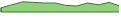
| Category | Series 0 |
|---|---|
| 0 | 7 |
| 1 | 12 |
| 2 | 17 |
| 3 | 16 |
| 4 | 15 |
| 5 | 15 |
| 6 | 11 |
| 7 | 10 |
| 8 | 15 |
| 9 | 12 |
| 10 | 16 |
| 11 | 10 |